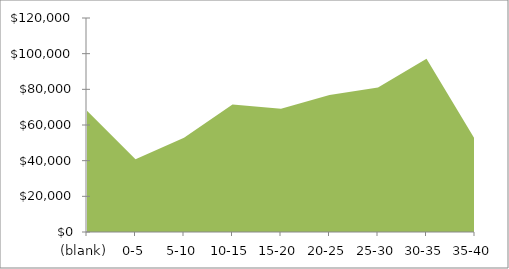
| Category | Total |
|---|---|
| (blank) | 68049.955 |
| 0-5 | 40855.942 |
| 5-10 | 52919.388 |
| 10-15 | 71484.934 |
| 15-20 | 69163.885 |
| 20-25 | 76776.076 |
| 25-30 | 81059.294 |
| 30-35 | 97199.153 |
| 35-40 | 51911.961 |